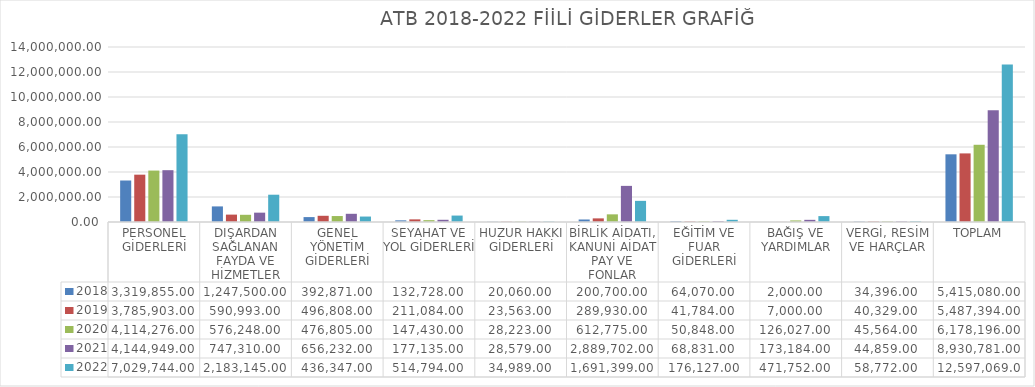
| Category | 2018 | 2019 | 2020 | 2021 | 2022 |
|---|---|---|---|---|---|
| PERSONEL GİDERLERİ | 3319855 | 3785903 | 4114276 | 4144949 | 7029744 |
| DIŞARDAN SAĞLANAN FAYDA VE HİZMETLER | 1247500 | 590993 | 576248 | 747310 | 2183145 |
| GENEL YÖNETİM GİDERLERİ | 392871 | 496808 | 476805 | 656232 | 436347 |
| SEYAHAT VE YOL GİDERLERİ | 132728 | 211084 | 147430 | 177135 | 514794 |
| HUZUR HAKKI GİDERLERİ | 20060 | 23563 | 28223 | 28579 | 34989 |
| BİRLİK AİDATI, KANUNİ AİDAT PAY VE FONLAR | 200700 | 289930 | 612775 | 2889702 | 1691399 |
| EĞİTİM VE FUAR GİDERLERİ | 64070 | 41784 | 50848 | 68831 | 176127 |
| BAĞIŞ VE YARDIMLAR | 2000 | 7000 | 126027 | 173184 | 471752 |
| VERGİ, RESİM VE HARÇLAR | 34396 | 40329 | 45564 | 44859 | 58772 |
| TOPLAM | 5415080 | 5487394 | 6178196 | 8930781 | 12597069 |